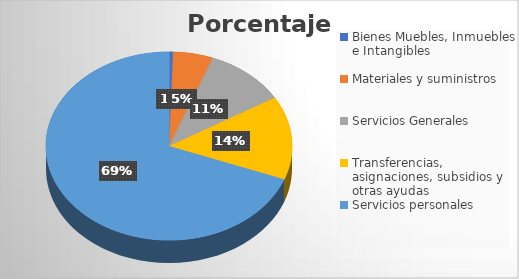
| Category | Porcentaje  |
|---|---|
| Bienes Muebles, Inmuebles e Intangibles | 0.527 |
| Materiales y suministros  | 5.244 |
| Servicios Generales | 10.636 |
| Transferencias, asignaciones, subsidios y otras ayudas | 14.354 |
| Servicios personales | 69.24 |